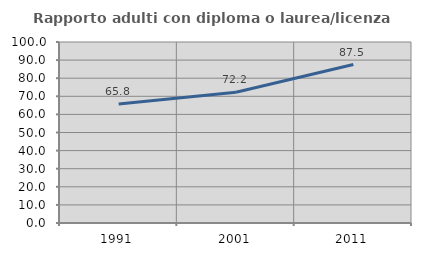
| Category | Rapporto adulti con diploma o laurea/licenza media  |
|---|---|
| 1991.0 | 65.782 |
| 2001.0 | 72.222 |
| 2011.0 | 87.549 |